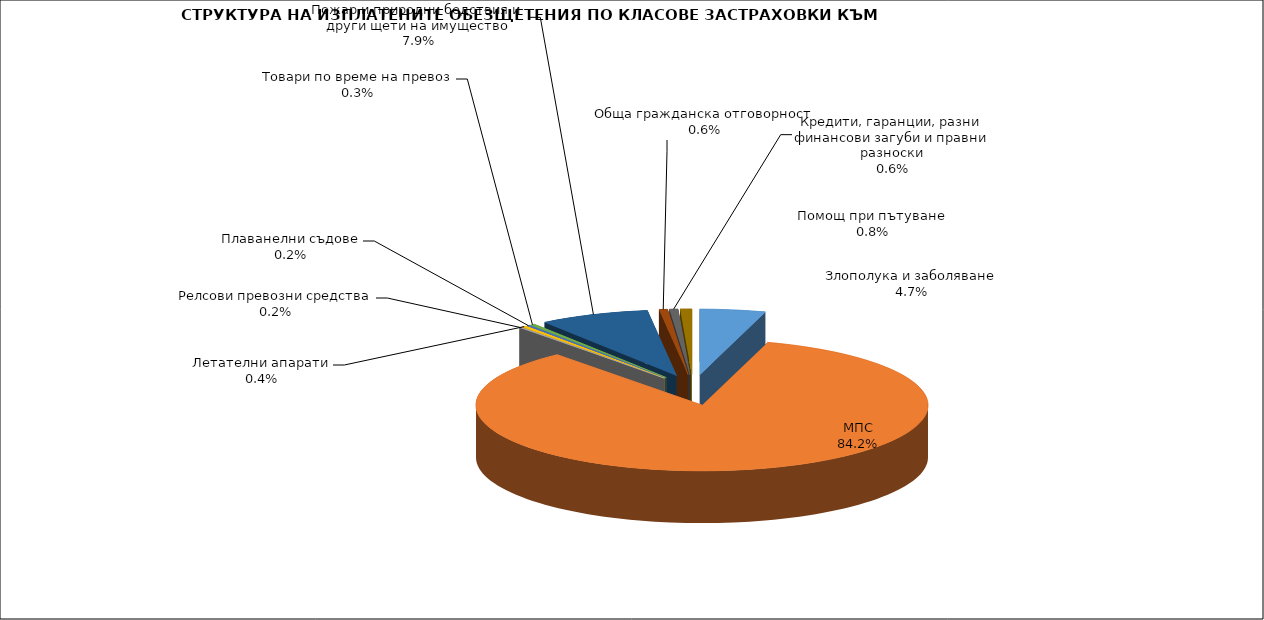
| Category | Series 0 |
|---|---|
| Злополука и заболяване | 0.047 |
| МПС | 0.842 |
| Релсови превозни средства | 0.002 |
| Летателни апарати | 0.004 |
| Плаванелни съдове | 0.002 |
| Товари по време на превоз | 0.003 |
| Пожар и природни бедствия и други щети на имущество | 0.079 |
| Обща гражданска отговорност | 0.006 |
| Кредити, гаранции, разни финансови загуби и правни разноски | 0.006 |
| Помощ при пътуване | 0.008 |